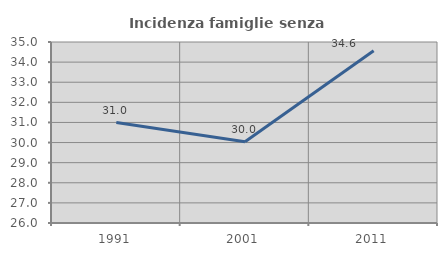
| Category | Incidenza famiglie senza nuclei |
|---|---|
| 1991.0 | 30.997 |
| 2001.0 | 30.04 |
| 2011.0 | 34.561 |